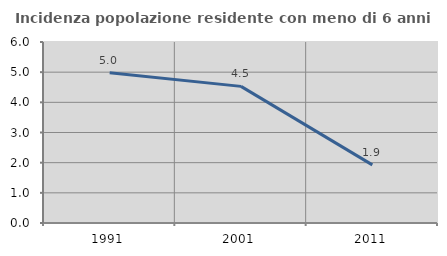
| Category | Incidenza popolazione residente con meno di 6 anni |
|---|---|
| 1991.0 | 4.978 |
| 2001.0 | 4.529 |
| 2011.0 | 1.926 |